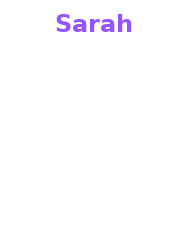
| Category | Sarah |
|---|---|
| 0 | 0 |
| 1 | 0 |